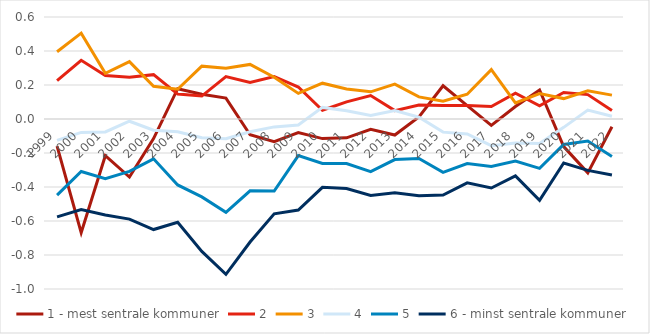
| Category | 1 - mest sentrale kommuner | 2 | 3 | 4 | 5 | 6 - minst sentrale kommuner  |
|---|---|---|---|---|---|---|
| 1999.0 | -0.16 | 0.225 | 0.395 | -0.126 | -0.448 | -0.576 |
| 2000.0 | -0.669 | 0.345 | 0.505 | -0.079 | -0.309 | -0.533 |
| 2001.0 | -0.216 | 0.256 | 0.269 | -0.076 | -0.352 | -0.564 |
| 2002.0 | -0.341 | 0.246 | 0.338 | -0.013 | -0.308 | -0.589 |
| 2003.0 | -0.116 | 0.261 | 0.192 | -0.066 | -0.234 | -0.65 |
| 2004.0 | 0.178 | 0.147 | 0.175 | -0.075 | -0.388 | -0.608 |
| 2005.0 | 0.146 | 0.135 | 0.311 | -0.11 | -0.458 | -0.779 |
| 2006.0 | 0.123 | 0.25 | 0.298 | -0.116 | -0.549 | -0.914 |
| 2007.0 | -0.092 | 0.215 | 0.321 | -0.075 | -0.422 | -0.724 |
| 2008.0 | -0.133 | 0.25 | 0.246 | -0.046 | -0.423 | -0.558 |
| 2009.0 | -0.08 | 0.188 | 0.151 | -0.035 | -0.215 | -0.536 |
| 2010.0 | -0.115 | 0.051 | 0.211 | 0.068 | -0.261 | -0.402 |
| 2011.0 | -0.111 | 0.101 | 0.177 | 0.048 | -0.262 | -0.409 |
| 2012.0 | -0.061 | 0.138 | 0.16 | 0.021 | -0.309 | -0.45 |
| 2013.0 | -0.094 | 0.049 | 0.205 | 0.05 | -0.239 | -0.434 |
| 2014.0 | 0.012 | 0.082 | 0.13 | 0.01 | -0.232 | -0.451 |
| 2015.0 | 0.196 | 0.08 | 0.104 | -0.077 | -0.314 | -0.447 |
| 2016.0 | 0.079 | 0.079 | 0.146 | -0.088 | -0.262 | -0.375 |
| 2017.0 | -0.037 | 0.073 | 0.29 | -0.157 | -0.28 | -0.406 |
| 2018.0 | 0.073 | 0.151 | 0.095 | -0.141 | -0.247 | -0.335 |
| 2019.0 | 0.171 | 0.078 | 0.15 | -0.145 | -0.29 | -0.479 |
| 2020.0 | -0.162 | 0.156 | 0.12 | -0.049 | -0.15 | -0.259 |
| 2021.0 | -0.317 | 0.144 | 0.166 | 0.053 | -0.129 | -0.302 |
| 2022.0 | -0.046 | 0.049 | 0.14 | 0.016 | -0.22 | -0.33 |